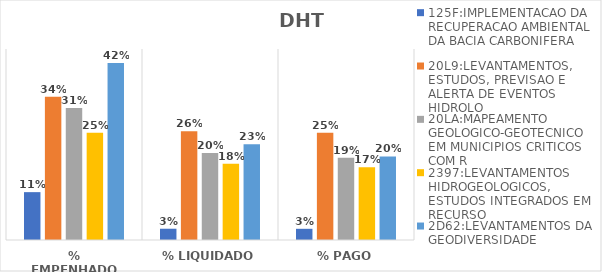
| Category | 125F:IMPLEMENTACAO DA RECUPERACAO AMBIENTAL DA BACIA CARBONIFERA | 20L9:LEVANTAMENTOS, ESTUDOS, PREVISAO E ALERTA DE EVENTOS HIDROLO | 20LA:MAPEAMENTO GEOLOGICO-GEOTECNICO EM MUNICIPIOS CRITICOS COM R | 2397:LEVANTAMENTOS HIDROGEOLOGICOS, ESTUDOS INTEGRADOS EM RECURSO | 2D62:LEVANTAMENTOS DA GEODIVERSIDADE |
|---|---|---|---|---|---|
| % EMPENHADO | 0.113 | 0.338 | 0.311 | 0.253 | 0.417 |
| % LIQUIDADO | 0.027 | 0.256 | 0.205 | 0.18 | 0.225 |
| % PAGO | 0.026 | 0.252 | 0.194 | 0.171 | 0.197 |